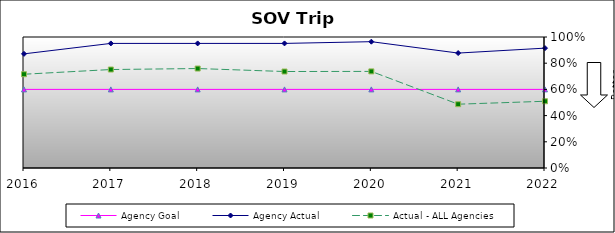
| Category | Agency Goal | Agency Actual | Actual - ALL Agencies |
|---|---|---|---|
| 2016.0 | 0.6 | 0.871 | 0.716 |
| 2017.0 | 0.6 | 0.951 | 0.752 |
| 2018.0 | 0.6 | 0.951 | 0.759 |
| 2019.0 | 0.6 | 0.951 | 0.736 |
| 2020.0 | 0.6 | 0.964 | 0.737 |
| 2021.0 | 0.6 | 0.877 | 0.487 |
| 2022.0 | 0.6 | 0.915 | 0.509 |